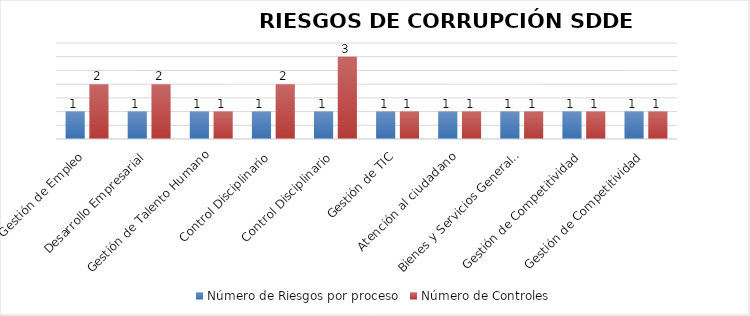
| Category | Número de Riesgos por proceso | Número de Controles |
|---|---|---|
| Gestión de Empleo | 1 | 2 |
|  Desarrollo Empresarial | 1 | 2 |
| Gestión de Talento Humano | 1 | 1 |
| Control Disciplinario | 1 | 2 |
| Control Disciplinario | 1 | 3 |
| Gestión de TIC | 1 | 1 |
| Atención al ciudadano | 1 | 1 |
| Bienes y Servicios Generales | 1 | 1 |
| Gestión de Competitividad | 1 | 1 |
| Gestión de Competitividad | 1 | 1 |